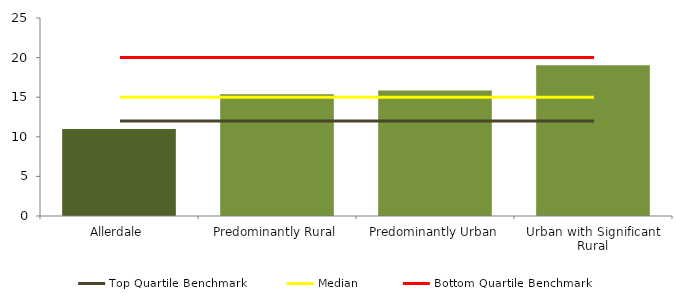
| Category | Series 0 |
|---|---|
| Allerdale | 11 |
| Predominantly Rural | 15.378 |
| Predominantly Urban | 15.849 |
| Urban with Significant Rural | 19.025 |